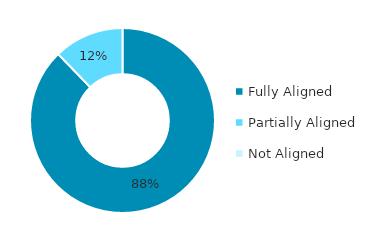
| Category | Series 0 |
|---|---|
| Fully Aligned | 0.878 |
| Partially Aligned | 0.122 |
| Not Aligned | 0 |